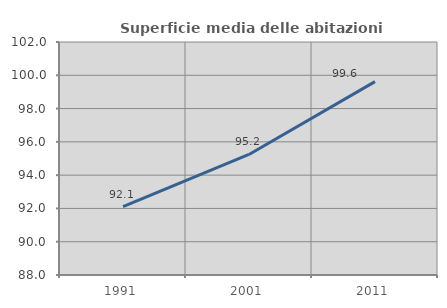
| Category | Superficie media delle abitazioni occupate |
|---|---|
| 1991.0 | 92.112 |
| 2001.0 | 95.244 |
| 2011.0 | 99.622 |